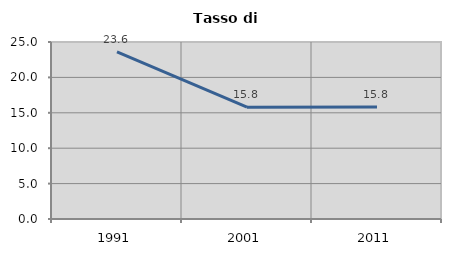
| Category | Tasso di disoccupazione   |
|---|---|
| 1991.0 | 23.591 |
| 2001.0 | 15.786 |
| 2011.0 | 15.823 |